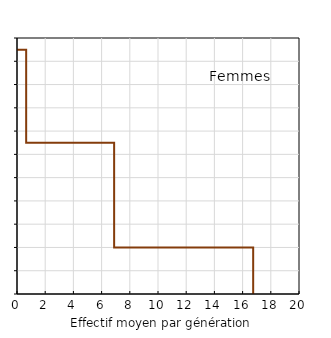
| Category | Femmes |
|---|---|
| 16.75 | 0 |
| 16.75 | 20 |
| 6.888888888888889 | 20 |
| 6.888888888888889 | 65 |
| 0.65 | 65 |
| 0.65 | 105 |
| 0.0 | 105 |